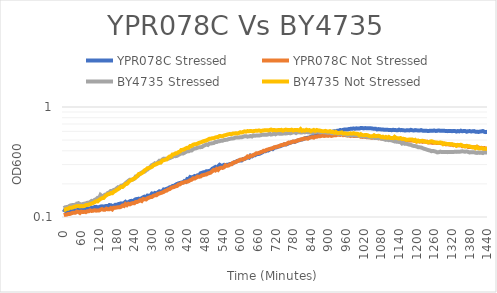
| Category | YPR078C Stressed | YPR078C Not Stressed | BY4735 Stressed | BY4735 Not Stressed |
|---|---|---|---|---|
| 0.0 | 0.111 | 0.104 | 0.12 | 0.117 |
| 5.0 | 0.117 | 0.105 | 0.122 | 0.116 |
| 10.0 | 0.111 | 0.105 | 0.123 | 0.119 |
| 15.0 | 0.113 | 0.106 | 0.123 | 0.119 |
| 20.0 | 0.112 | 0.107 | 0.127 | 0.122 |
| 25.0 | 0.114 | 0.108 | 0.128 | 0.121 |
| 30.0 | 0.114 | 0.109 | 0.129 | 0.122 |
| 35.0 | 0.117 | 0.11 | 0.129 | 0.124 |
| 40.0 | 0.116 | 0.11 | 0.125 | 0.125 |
| 45.0 | 0.116 | 0.112 | 0.132 | 0.126 |
| 50.0 | 0.117 | 0.111 | 0.134 | 0.126 |
| 54.99999999999999 | 0.117 | 0.109 | 0.131 | 0.125 |
| 60.0 | 0.117 | 0.112 | 0.13 | 0.126 |
| 65.0 | 0.117 | 0.111 | 0.131 | 0.125 |
| 70.0 | 0.119 | 0.112 | 0.132 | 0.126 |
| 75.0 | 0.118 | 0.111 | 0.133 | 0.128 |
| 80.0 | 0.119 | 0.113 | 0.135 | 0.129 |
| 85.00000000000001 | 0.12 | 0.113 | 0.135 | 0.13 |
| 90.0 | 0.12 | 0.115 | 0.137 | 0.131 |
| 95.0 | 0.122 | 0.113 | 0.14 | 0.133 |
| 99.99999999999999 | 0.121 | 0.114 | 0.139 | 0.134 |
| 105.0 | 0.123 | 0.115 | 0.143 | 0.136 |
| 110.00000000000001 | 0.124 | 0.114 | 0.145 | 0.139 |
| 114.99999999999999 | 0.122 | 0.114 | 0.149 | 0.139 |
| 120.0 | 0.123 | 0.114 | 0.148 | 0.143 |
| 125.00000000000001 | 0.124 | 0.117 | 0.159 | 0.146 |
| 130.0 | 0.125 | 0.118 | 0.155 | 0.148 |
| 135.0 | 0.124 | 0.116 | 0.155 | 0.149 |
| 140.0 | 0.125 | 0.116 | 0.159 | 0.154 |
| 144.99999999999997 | 0.126 | 0.119 | 0.16 | 0.158 |
| 150.0 | 0.125 | 0.118 | 0.165 | 0.161 |
| 155.0 | 0.128 | 0.118 | 0.167 | 0.162 |
| 160.0 | 0.128 | 0.12 | 0.172 | 0.165 |
| 165.0 | 0.126 | 0.117 | 0.172 | 0.164 |
| 170.00000000000003 | 0.126 | 0.122 | 0.176 | 0.17 |
| 175.0 | 0.129 | 0.121 | 0.177 | 0.172 |
| 180.0 | 0.129 | 0.122 | 0.182 | 0.176 |
| 185.00000000000003 | 0.131 | 0.123 | 0.186 | 0.179 |
| 190.0 | 0.132 | 0.122 | 0.185 | 0.184 |
| 195.0 | 0.133 | 0.124 | 0.192 | 0.188 |
| 200.0 | 0.132 | 0.127 | 0.194 | 0.188 |
| 205.0 | 0.134 | 0.126 | 0.197 | 0.193 |
| 210.0 | 0.137 | 0.131 | 0.203 | 0.199 |
| 215.0 | 0.134 | 0.128 | 0.208 | 0.2 |
| 219.99999999999997 | 0.137 | 0.132 | 0.213 | 0.207 |
| 225.0 | 0.139 | 0.13 | 0.218 | 0.214 |
| 230.00000000000003 | 0.14 | 0.133 | 0.218 | 0.217 |
| 235.0 | 0.139 | 0.134 | 0.219 | 0.22 |
| 240.0 | 0.142 | 0.133 | 0.223 | 0.224 |
| 244.99999999999997 | 0.145 | 0.137 | 0.234 | 0.228 |
| 250.00000000000003 | 0.146 | 0.137 | 0.234 | 0.236 |
| 255.0 | 0.147 | 0.139 | 0.24 | 0.246 |
| 260.0 | 0.145 | 0.142 | 0.249 | 0.246 |
| 265.0 | 0.148 | 0.14 | 0.254 | 0.25 |
| 270.0 | 0.151 | 0.146 | 0.258 | 0.256 |
| 275.0 | 0.153 | 0.145 | 0.259 | 0.266 |
| 280.0 | 0.151 | 0.144 | 0.266 | 0.27 |
| 285.0 | 0.157 | 0.148 | 0.271 | 0.278 |
| 289.99999999999994 | 0.156 | 0.15 | 0.279 | 0.278 |
| 295.00000000000006 | 0.157 | 0.152 | 0.287 | 0.282 |
| 300.0 | 0.164 | 0.152 | 0.296 | 0.286 |
| 305.0 | 0.162 | 0.156 | 0.3 | 0.296 |
| 310.0 | 0.165 | 0.157 | 0.308 | 0.298 |
| 315.0 | 0.164 | 0.158 | 0.304 | 0.304 |
| 320.0 | 0.167 | 0.162 | 0.314 | 0.307 |
| 325.0 | 0.171 | 0.164 | 0.324 | 0.311 |
| 330.0 | 0.171 | 0.165 | 0.318 | 0.313 |
| 334.99999999999994 | 0.171 | 0.167 | 0.333 | 0.326 |
| 340.00000000000006 | 0.178 | 0.169 | 0.339 | 0.328 |
| 345.0 | 0.177 | 0.173 | 0.337 | 0.331 |
| 350.0 | 0.181 | 0.174 | 0.338 | 0.333 |
| 355.0 | 0.182 | 0.178 | 0.339 | 0.345 |
| 360.0 | 0.186 | 0.179 | 0.343 | 0.355 |
| 365.0 | 0.186 | 0.184 | 0.348 | 0.355 |
| 370.00000000000006 | 0.191 | 0.186 | 0.352 | 0.371 |
| 375.0 | 0.191 | 0.187 | 0.362 | 0.371 |
| 380.0 | 0.196 | 0.19 | 0.357 | 0.379 |
| 385.0 | 0.2 | 0.191 | 0.36 | 0.38 |
| 390.0 | 0.202 | 0.197 | 0.367 | 0.389 |
| 394.99999999999994 | 0.204 | 0.198 | 0.373 | 0.394 |
| 400.0 | 0.205 | 0.203 | 0.378 | 0.407 |
| 405.0 | 0.206 | 0.205 | 0.377 | 0.408 |
| 410.0 | 0.212 | 0.207 | 0.383 | 0.413 |
| 415.00000000000006 | 0.209 | 0.209 | 0.39 | 0.421 |
| 420.0 | 0.222 | 0.21 | 0.396 | 0.426 |
| 425.0 | 0.222 | 0.212 | 0.396 | 0.427 |
| 430.0 | 0.231 | 0.216 | 0.403 | 0.442 |
| 435.0 | 0.229 | 0.218 | 0.403 | 0.442 |
| 439.99999999999994 | 0.232 | 0.225 | 0.413 | 0.454 |
| 445.0 | 0.236 | 0.224 | 0.419 | 0.458 |
| 450.0 | 0.233 | 0.227 | 0.421 | 0.46 |
| 455.0 | 0.24 | 0.233 | 0.427 | 0.464 |
| 460.00000000000006 | 0.24 | 0.232 | 0.43 | 0.472 |
| 465.0 | 0.249 | 0.234 | 0.431 | 0.476 |
| 470.0 | 0.252 | 0.239 | 0.433 | 0.482 |
| 475.0 | 0.255 | 0.24 | 0.443 | 0.489 |
| 480.0 | 0.255 | 0.243 | 0.449 | 0.493 |
| 485.00000000000006 | 0.26 | 0.244 | 0.457 | 0.497 |
| 489.99999999999994 | 0.26 | 0.249 | 0.452 | 0.504 |
| 495.0 | 0.262 | 0.25 | 0.465 | 0.514 |
| 500.00000000000006 | 0.264 | 0.253 | 0.465 | 0.515 |
| 504.99999999999994 | 0.274 | 0.261 | 0.468 | 0.52 |
| 510.0 | 0.279 | 0.268 | 0.47 | 0.521 |
| 515.0 | 0.284 | 0.265 | 0.48 | 0.528 |
| 520.0 | 0.278 | 0.274 | 0.48 | 0.532 |
| 525.0 | 0.289 | 0.268 | 0.488 | 0.533 |
| 530.0 | 0.298 | 0.278 | 0.489 | 0.545 |
| 534.9999999999999 | 0.293 | 0.28 | 0.495 | 0.544 |
| 540.0 | 0.292 | 0.279 | 0.494 | 0.542 |
| 545.0000000000001 | 0.298 | 0.283 | 0.5 | 0.551 |
| 550.0 | 0.295 | 0.295 | 0.502 | 0.554 |
| 555.0 | 0.299 | 0.292 | 0.504 | 0.56 |
| 560.0 | 0.299 | 0.294 | 0.51 | 0.565 |
| 565.0 | 0.303 | 0.3 | 0.513 | 0.568 |
| 570.0 | 0.304 | 0.301 | 0.517 | 0.565 |
| 575.0 | 0.307 | 0.311 | 0.517 | 0.573 |
| 579.9999999999999 | 0.315 | 0.313 | 0.521 | 0.573 |
| 585.0 | 0.317 | 0.316 | 0.529 | 0.578 |
| 590.0000000000001 | 0.324 | 0.321 | 0.528 | 0.574 |
| 595.0 | 0.326 | 0.325 | 0.527 | 0.58 |
| 600.0 | 0.327 | 0.332 | 0.532 | 0.589 |
| 605.0 | 0.327 | 0.334 | 0.53 | 0.586 |
| 610.0 | 0.337 | 0.334 | 0.537 | 0.594 |
| 615.0 | 0.337 | 0.34 | 0.543 | 0.6 |
| 620.0 | 0.344 | 0.344 | 0.543 | 0.597 |
| 624.9999999999999 | 0.348 | 0.355 | 0.537 | 0.604 |
| 630.0 | 0.346 | 0.351 | 0.54 | 0.602 |
| 635.0000000000001 | 0.362 | 0.36 | 0.545 | 0.606 |
| 640.0 | 0.356 | 0.36 | 0.539 | 0.603 |
| 645.0 | 0.363 | 0.366 | 0.552 | 0.603 |
| 650.0 | 0.364 | 0.371 | 0.548 | 0.607 |
| 655.0 | 0.372 | 0.38 | 0.55 | 0.608 |
| 660.0 | 0.373 | 0.38 | 0.55 | 0.609 |
| 665.0 | 0.375 | 0.382 | 0.551 | 0.612 |
| 669.9999999999999 | 0.381 | 0.389 | 0.555 | 0.604 |
| 675.0 | 0.387 | 0.392 | 0.56 | 0.61 |
| 680.0000000000001 | 0.395 | 0.401 | 0.56 | 0.612 |
| 685.0 | 0.395 | 0.4 | 0.56 | 0.616 |
| 690.0 | 0.403 | 0.408 | 0.559 | 0.616 |
| 695.0 | 0.402 | 0.411 | 0.563 | 0.613 |
| 700.0 | 0.41 | 0.416 | 0.572 | 0.618 |
| 705.0 | 0.417 | 0.417 | 0.561 | 0.624 |
| 710.0 | 0.414 | 0.422 | 0.566 | 0.614 |
| 714.9999999999999 | 0.426 | 0.429 | 0.575 | 0.618 |
| 720.0 | 0.428 | 0.433 | 0.565 | 0.616 |
| 725.0 | 0.431 | 0.435 | 0.573 | 0.613 |
| 730.0 | 0.437 | 0.438 | 0.575 | 0.619 |
| 735.0 | 0.439 | 0.445 | 0.57 | 0.617 |
| 740.0000000000001 | 0.445 | 0.451 | 0.571 | 0.62 |
| 744.9999999999999 | 0.45 | 0.451 | 0.573 | 0.609 |
| 750.0 | 0.458 | 0.459 | 0.576 | 0.617 |
| 755.0 | 0.456 | 0.458 | 0.575 | 0.623 |
| 760.0 | 0.461 | 0.467 | 0.577 | 0.619 |
| 765.0 | 0.468 | 0.475 | 0.584 | 0.618 |
| 770.0 | 0.473 | 0.473 | 0.576 | 0.616 |
| 775.0 | 0.479 | 0.48 | 0.582 | 0.622 |
| 780.0 | 0.483 | 0.486 | 0.588 | 0.611 |
| 785.0000000000001 | 0.481 | 0.484 | 0.589 | 0.619 |
| 789.9999999999999 | 0.488 | 0.489 | 0.58 | 0.619 |
| 795.0 | 0.495 | 0.497 | 0.591 | 0.617 |
| 800.0 | 0.499 | 0.5 | 0.59 | 0.612 |
| 805.0 | 0.503 | 0.507 | 0.586 | 0.629 |
| 810.0 | 0.506 | 0.509 | 0.587 | 0.608 |
| 815.0 | 0.511 | 0.514 | 0.592 | 0.615 |
| 820.0 | 0.519 | 0.519 | 0.588 | 0.61 |
| 825.0 | 0.523 | 0.517 | 0.593 | 0.622 |
| 830.0000000000001 | 0.526 | 0.515 | 0.589 | 0.614 |
| 834.9999999999999 | 0.527 | 0.526 | 0.587 | 0.617 |
| 840.0 | 0.536 | 0.529 | 0.586 | 0.603 |
| 845.0 | 0.542 | 0.532 | 0.59 | 0.612 |
| 850.0 | 0.54 | 0.527 | 0.592 | 0.619 |
| 855.0 | 0.545 | 0.54 | 0.594 | 0.606 |
| 860.0 | 0.556 | 0.536 | 0.594 | 0.618 |
| 865.0 | 0.559 | 0.544 | 0.595 | 0.612 |
| 870.0 | 0.566 | 0.541 | 0.589 | 0.611 |
| 875.0000000000001 | 0.564 | 0.545 | 0.59 | 0.607 |
| 879.9999999999999 | 0.574 | 0.551 | 0.593 | 0.601 |
| 885.0 | 0.575 | 0.545 | 0.59 | 0.602 |
| 890.0 | 0.582 | 0.549 | 0.588 | 0.607 |
| 895.0 | 0.584 | 0.549 | 0.585 | 0.6 |
| 900.0 | 0.591 | 0.547 | 0.583 | 0.598 |
| 905.0 | 0.587 | 0.557 | 0.586 | 0.604 |
| 910.0 | 0.593 | 0.546 | 0.579 | 0.592 |
| 915.0 | 0.597 | 0.55 | 0.578 | 0.596 |
| 920.0000000000001 | 0.602 | 0.555 | 0.577 | 0.584 |
| 924.9999999999999 | 0.6 | 0.553 | 0.577 | 0.594 |
| 930.0 | 0.609 | 0.56 | 0.575 | 0.581 |
| 935.0 | 0.609 | 0.56 | 0.57 | 0.581 |
| 940.0 | 0.618 | 0.557 | 0.571 | 0.584 |
| 945.0 | 0.612 | 0.565 | 0.569 | 0.587 |
| 950.0 | 0.62 | 0.555 | 0.565 | 0.573 |
| 955.0 | 0.624 | 0.556 | 0.565 | 0.576 |
| 960.0 | 0.623 | 0.554 | 0.56 | 0.573 |
| 964.9999999999999 | 0.623 | 0.55 | 0.552 | 0.571 |
| 970.0000000000001 | 0.632 | 0.552 | 0.561 | 0.573 |
| 975.0 | 0.633 | 0.545 | 0.554 | 0.576 |
| 979.9999999999999 | 0.633 | 0.55 | 0.551 | 0.573 |
| 985.0 | 0.638 | 0.546 | 0.554 | 0.578 |
| 990.0 | 0.634 | 0.545 | 0.554 | 0.573 |
| 995.0 | 0.64 | 0.544 | 0.55 | 0.571 |
| 1000.0000000000001 | 0.636 | 0.546 | 0.549 | 0.569 |
| 1005.0 | 0.636 | 0.547 | 0.546 | 0.553 |
| 1009.9999999999999 | 0.645 | 0.536 | 0.546 | 0.566 |
| 1015.0000000000001 | 0.644 | 0.535 | 0.542 | 0.556 |
| 1020.0 | 0.639 | 0.536 | 0.543 | 0.553 |
| 1024.9999999999998 | 0.643 | 0.535 | 0.539 | 0.558 |
| 1030.0 | 0.642 | 0.531 | 0.537 | 0.556 |
| 1035.0 | 0.643 | 0.532 | 0.534 | 0.551 |
| 1040.0 | 0.642 | 0.531 | 0.53 | 0.543 |
| 1045.0000000000002 | 0.64 | 0.527 | 0.531 | 0.543 |
| 1050.0 | 0.636 | 0.526 | 0.53 | 0.542 |
| 1055.0 | 0.634 | 0.528 | 0.528 | 0.553 |
| 1060.0 | 0.635 | 0.522 | 0.523 | 0.542 |
| 1065.0 | 0.625 | 0.525 | 0.523 | 0.545 |
| 1069.9999999999998 | 0.63 | 0.52 | 0.52 | 0.548 |
| 1075.0 | 0.627 | 0.522 | 0.521 | 0.542 |
| 1080.0 | 0.625 | 0.518 | 0.515 | 0.531 |
| 1085.0 | 0.625 | 0.517 | 0.512 | 0.537 |
| 1090.0000000000002 | 0.62 | 0.516 | 0.508 | 0.526 |
| 1095.0 | 0.621 | 0.517 | 0.502 | 0.534 |
| 1100.0 | 0.62 | 0.517 | 0.504 | 0.525 |
| 1105.0 | 0.619 | 0.518 | 0.5 | 0.535 |
| 1110.0 | 0.619 | 0.514 | 0.501 | 0.523 |
| 1114.9999999999998 | 0.615 | 0.512 | 0.497 | 0.523 |
| 1120.0 | 0.62 | 0.511 | 0.492 | 0.521 |
| 1125.0 | 0.618 | 0.507 | 0.486 | 0.536 |
| 1130.0 | 0.616 | 0.504 | 0.485 | 0.523 |
| 1135.0000000000002 | 0.614 | 0.506 | 0.483 | 0.52 |
| 1140.0 | 0.622 | 0.506 | 0.481 | 0.517 |
| 1145.0 | 0.615 | 0.503 | 0.48 | 0.522 |
| 1150.0 | 0.617 | 0.503 | 0.465 | 0.512 |
| 1155.0 | 0.615 | 0.499 | 0.472 | 0.514 |
| 1159.9999999999998 | 0.611 | 0.501 | 0.463 | 0.511 |
| 1165.0 | 0.613 | 0.496 | 0.465 | 0.502 |
| 1170.0 | 0.614 | 0.498 | 0.458 | 0.505 |
| 1175.0 | 0.612 | 0.495 | 0.455 | 0.506 |
| 1180.0000000000002 | 0.62 | 0.496 | 0.453 | 0.506 |
| 1185.0 | 0.614 | 0.495 | 0.446 | 0.506 |
| 1190.0 | 0.611 | 0.496 | 0.443 | 0.495 |
| 1195.0 | 0.616 | 0.49 | 0.441 | 0.502 |
| 1200.0 | 0.614 | 0.485 | 0.438 | 0.486 |
| 1204.9999999999998 | 0.612 | 0.489 | 0.431 | 0.495 |
| 1210.0 | 0.61 | 0.485 | 0.43 | 0.488 |
| 1215.0 | 0.616 | 0.489 | 0.428 | 0.492 |
| 1220.0 | 0.609 | 0.482 | 0.423 | 0.493 |
| 1225.0000000000002 | 0.61 | 0.487 | 0.417 | 0.487 |
| 1230.0 | 0.608 | 0.482 | 0.414 | 0.485 |
| 1235.0 | 0.607 | 0.484 | 0.409 | 0.479 |
| 1240.0 | 0.604 | 0.475 | 0.405 | 0.477 |
| 1245.0 | 0.609 | 0.477 | 0.403 | 0.484 |
| 1249.9999999999998 | 0.609 | 0.475 | 0.396 | 0.488 |
| 1255.0 | 0.608 | 0.471 | 0.399 | 0.484 |
| 1260.0 | 0.612 | 0.475 | 0.396 | 0.475 |
| 1265.0 | 0.605 | 0.472 | 0.393 | 0.477 |
| 1270.0000000000002 | 0.608 | 0.47 | 0.387 | 0.475 |
| 1275.0 | 0.613 | 0.47 | 0.388 | 0.472 |
| 1280.0 | 0.608 | 0.47 | 0.393 | 0.476 |
| 1285.0 | 0.607 | 0.468 | 0.389 | 0.473 |
| 1290.0 | 0.608 | 0.466 | 0.39 | 0.459 |
| 1294.9999999999998 | 0.607 | 0.462 | 0.391 | 0.467 |
| 1300.0 | 0.605 | 0.457 | 0.391 | 0.463 |
| 1305.0 | 0.603 | 0.459 | 0.389 | 0.46 |
| 1310.0 | 0.606 | 0.456 | 0.39 | 0.461 |
| 1315.0000000000002 | 0.606 | 0.454 | 0.389 | 0.46 |
| 1320.0 | 0.603 | 0.456 | 0.391 | 0.459 |
| 1325.0 | 0.606 | 0.45 | 0.39 | 0.454 |
| 1330.0 | 0.605 | 0.452 | 0.392 | 0.452 |
| 1335.0 | 0.598 | 0.448 | 0.391 | 0.443 |
| 1339.9999999999998 | 0.605 | 0.448 | 0.392 | 0.452 |
| 1345.0 | 0.6 | 0.447 | 0.392 | 0.451 |
| 1350.0 | 0.609 | 0.449 | 0.394 | 0.454 |
| 1355.0 | 0.602 | 0.441 | 0.396 | 0.446 |
| 1360.0000000000002 | 0.605 | 0.441 | 0.393 | 0.441 |
| 1365.0 | 0.605 | 0.441 | 0.392 | 0.437 |
| 1370.0 | 0.596 | 0.443 | 0.394 | 0.443 |
| 1375.0 | 0.603 | 0.433 | 0.391 | 0.439 |
| 1380.0 | 0.604 | 0.432 | 0.386 | 0.439 |
| 1384.9999999999998 | 0.599 | 0.432 | 0.389 | 0.434 |
| 1390.0 | 0.602 | 0.43 | 0.388 | 0.431 |
| 1395.0 | 0.604 | 0.43 | 0.388 | 0.432 |
| 1400.0 | 0.597 | 0.43 | 0.384 | 0.422 |
| 1405.0000000000002 | 0.597 | 0.434 | 0.382 | 0.434 |
| 1410.0 | 0.593 | 0.428 | 0.385 | 0.421 |
| 1415.0 | 0.598 | 0.425 | 0.383 | 0.419 |
| 1420.0 | 0.6 | 0.425 | 0.384 | 0.423 |
| 1425.0 | 0.605 | 0.42 | 0.381 | 0.419 |
| 1429.9999999999998 | 0.594 | 0.423 | 0.387 | 0.417 |
| 1435.0 | 0.591 | 0.417 | 0.386 | 0.417 |
| 1440.0 | 0.595 | 0.421 | 0.386 | 0.419 |